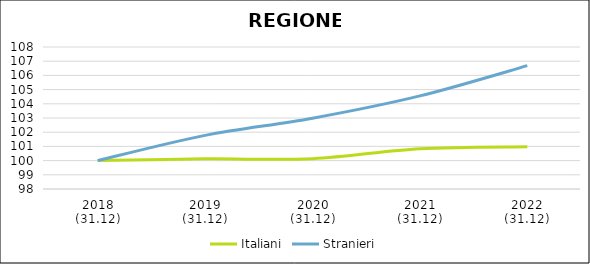
| Category | Italiani | Stranieri |
|---|---|---|
| 2018
(31.12) | 100 | 100 |
| 2019
(31.12) | 100.122 | 101.777 |
| 2020
(31.12) | 100.134 | 102.986 |
| 2021
(31.12) | 100.837 | 104.557 |
| 2022
(31.12) | 100.979 | 106.685 |